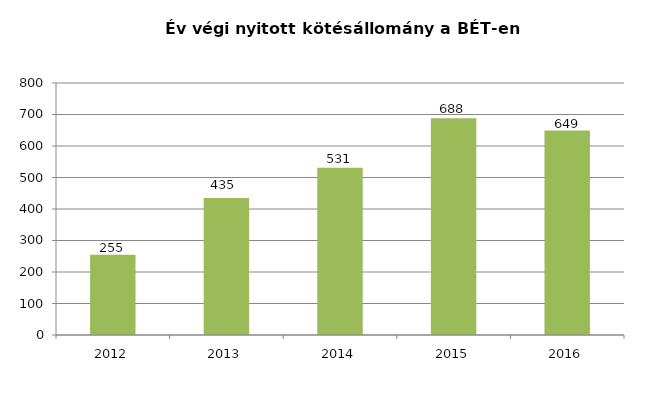
| Category | BÉT kontraktus (ezer db) |
|---|---|
| 2012.0 | 255 |
| 2013.0 | 435 |
| 2014.0 | 531 |
| 2015.0 | 688.194 |
| 2016.0 | 648.876 |